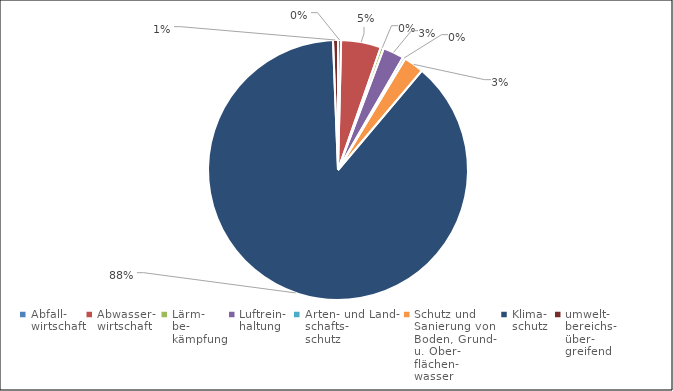
| Category | 2021 |
|---|---|
| Abfall-
wirtschaft | 9050.642 |
| Abwasser-
wirtschaft | 116821.21 |
| Lärm-
be-
kämpfung | 9145.713 |
| Luftrein-
haltung | 61383.963 |
| Arten- und Land-
schafts-
schutz | 7513.426 |
| Schutz und
Sanierung von
Boden, Grund-
u. Ober-
flächen-
wasser | 59480.1 |
| Klima-
schutz | 2081112.609 |
| umwelt-
bereichs-
über-
greifend | 14531.009 |